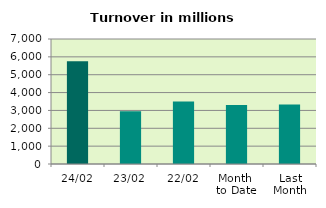
| Category | Series 0 |
|---|---|
| 24/02 | 5748.766 |
| 23/02 | 2952.807 |
| 22/02 | 3506.368 |
| Month 
to Date | 3305.532 |
| Last
Month | 3330.335 |